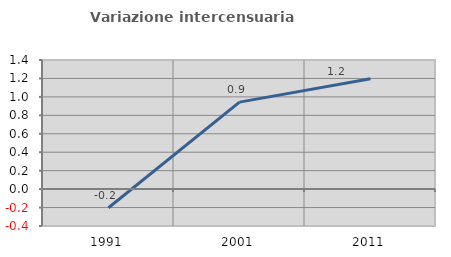
| Category | Variazione intercensuaria annua |
|---|---|
| 1991.0 | -0.203 |
| 2001.0 | 0.943 |
| 2011.0 | 1.197 |